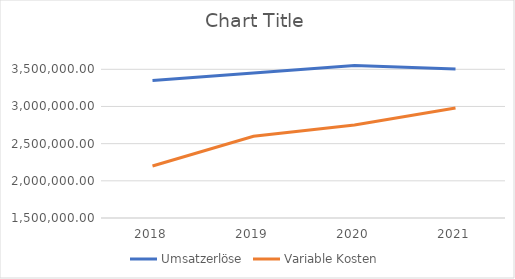
| Category | Umsatzerlöse | Variable Kosten |
|---|---|---|
| 2018.0 | 3350000 | 2200000 |
| 2019.0 | 3450000 | 2600000 |
| 2020.0 | 3552000 | 2750000 |
| 2021.0 | 3504000 | 2980000 |